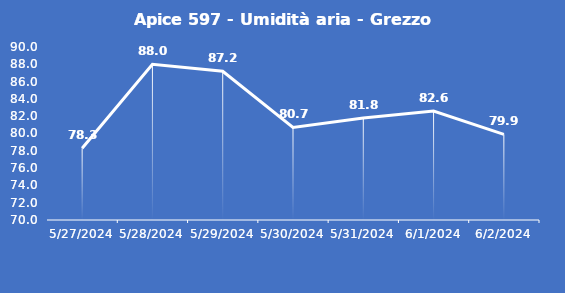
| Category | Apice 597 - Umidità aria - Grezzo (%) |
|---|---|
| 5/27/24 | 78.3 |
| 5/28/24 | 88 |
| 5/29/24 | 87.2 |
| 5/30/24 | 80.7 |
| 5/31/24 | 81.8 |
| 6/1/24 | 82.6 |
| 6/2/24 | 79.9 |